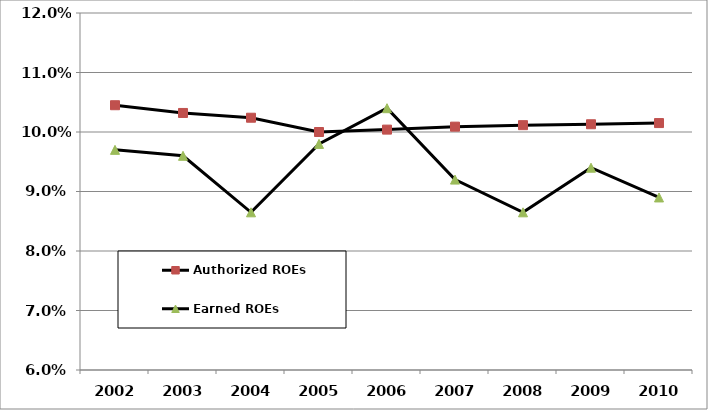
| Category | Authorized ROEs | Earned ROEs |
|---|---|---|
| 2002.0 | 0.104 | 0.097 |
| 2003.0 | 0.103 | 0.096 |
| 2004.0 | 0.102 | 0.086 |
| 2005.0 | 0.1 | 0.098 |
| 2006.0 | 0.1 | 0.104 |
| 2007.0 | 0.101 | 0.092 |
| 2008.0 | 0.101 | 0.086 |
| 2009.0 | 0.101 | 0.094 |
| 2010.0 | 0.102 | 0.089 |